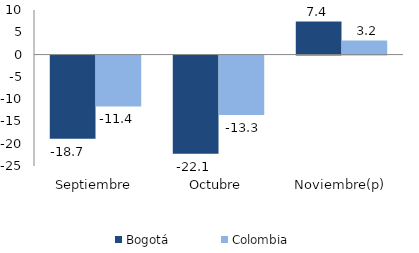
| Category | Bogotá | Colombia |
|---|---|---|
| Septiembre | -18.683 | -11.424 |
| Octubre | -22.054 | -13.32 |
| Noviembre(p) | 7.425 | 3.16 |